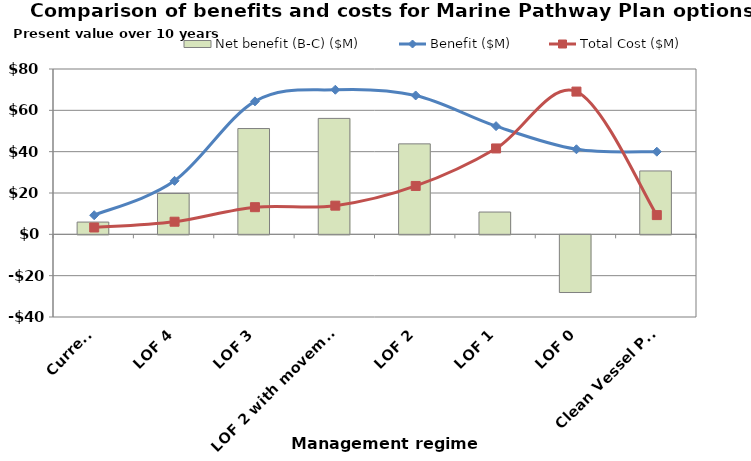
| Category | Net benefit (B-C) ($M) |
|---|---|
| Current  | 5.934 |
| LOF 4 | 19.787 |
| LOF 3 | 51.191 |
| LOF 2 with movement | 56.094 |
| LOF 2 | 43.776 |
| LOF 1 | 10.79 |
| LOF 0 | -27.917 |
| Clean Vessel Pass | 30.674 |